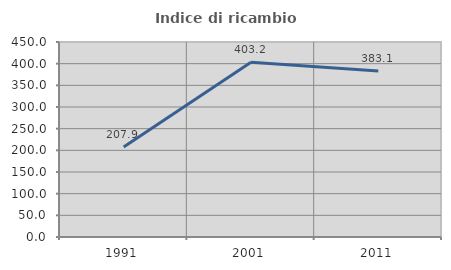
| Category | Indice di ricambio occupazionale  |
|---|---|
| 1991.0 | 207.937 |
| 2001.0 | 403.2 |
| 2011.0 | 383.117 |